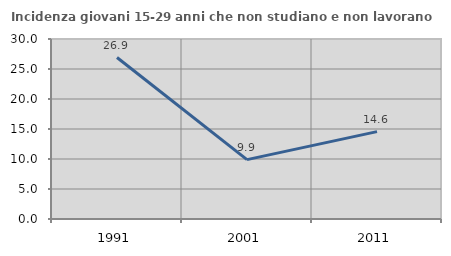
| Category | Incidenza giovani 15-29 anni che non studiano e non lavorano  |
|---|---|
| 1991.0 | 26.912 |
| 2001.0 | 9.899 |
| 2011.0 | 14.565 |